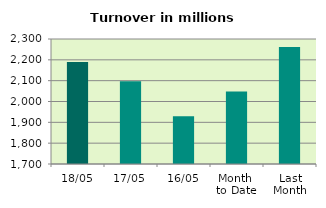
| Category | Series 0 |
|---|---|
| 18/05 | 2189.479 |
| 17/05 | 2096.943 |
| 16/05 | 1928.788 |
| Month 
to Date | 2048.222 |
| Last
Month | 2261.282 |